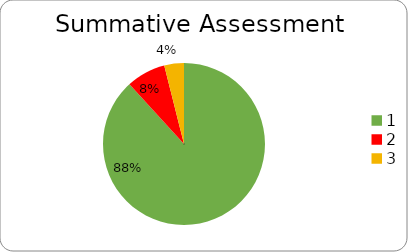
| Category | Series 0 |
|---|---|
| 0 | 0.882 |
| 1 | 0.078 |
| 2 | 0.039 |